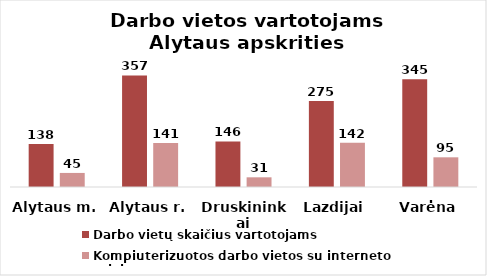
| Category | Darbo vietų skaičius vartotojams | Kompiuterizuotos darbo vietos su interneto prieiga |
|---|---|---|
| Alytaus m. | 138 | 45 |
| Alytaus r. | 357 | 141 |
| Druskininkai | 146 | 31 |
| Lazdijai | 275 | 142 |
| Varėna | 345 | 95 |